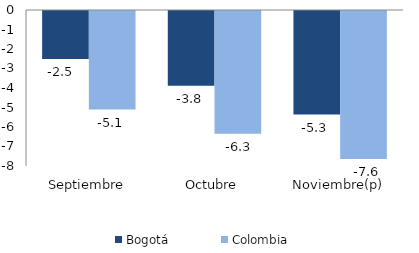
| Category | Bogotá | Colombia |
|---|---|---|
| Septiembre | -2.462 | -5.053 |
| Octubre | -3.834 | -6.296 |
| Noviembre(p) | -5.309 | -7.594 |